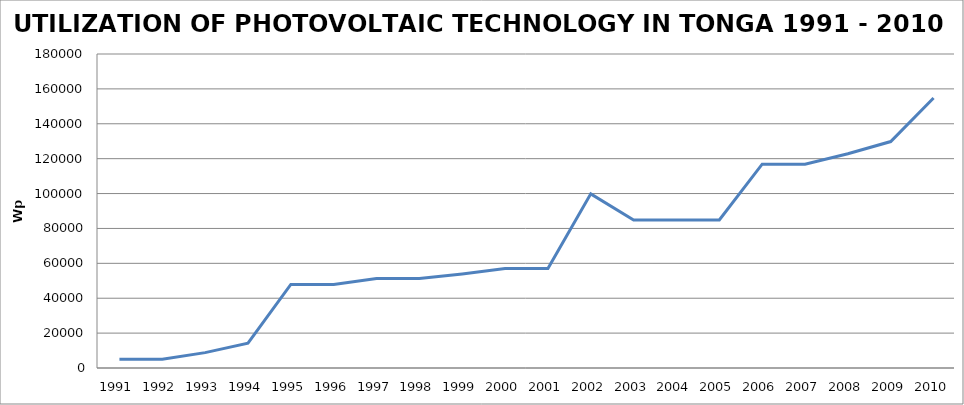
| Category | Series 0 |
|---|---|
| 1991 | 4956 |
| 1992 | 4956 |
| 1993 | 8806 |
| 1994 | 14196 |
| 1995 | 47896 |
| 1996 | 47896 |
| 1997 | 51306 |
| 1998 | 51306 |
| 1999 | 53906 |
| 2000 | 56978 |
| 2001 | 56978 |
| 2002 | 99826 |
| 2003 | 84826 |
| 2004 | 84826 |
| 2005 | 84826 |
| 2006 | 116866 |
| 2007 | 116866 |
| 2008 | 122806 |
| 2009 | 129806 |
| 2010 | 154806 |